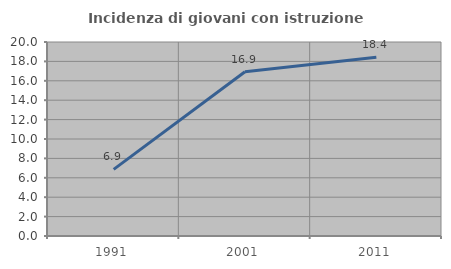
| Category | Incidenza di giovani con istruzione universitaria |
|---|---|
| 1991.0 | 6.87 |
| 2001.0 | 16.935 |
| 2011.0 | 18.421 |